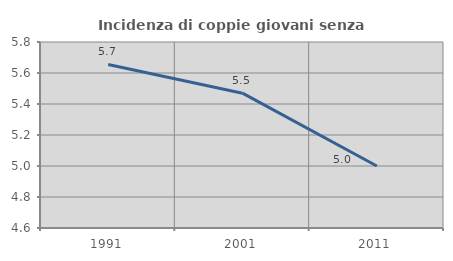
| Category | Incidenza di coppie giovani senza figli |
|---|---|
| 1991.0 | 5.655 |
| 2001.0 | 5.47 |
| 2011.0 | 5 |